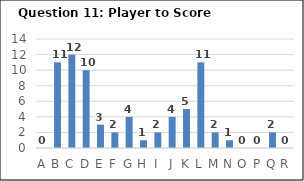
| Category | Series 0 |
|---|---|
| A | 0 |
| B | 11 |
| C | 12 |
| D | 10 |
| E | 3 |
| F | 2 |
| G | 4 |
| H | 1 |
| I | 2 |
| J | 4 |
| K | 5 |
| L | 11 |
| M | 2 |
| N | 1 |
| O | 0 |
| P | 0 |
| Q | 2 |
| R | 0 |